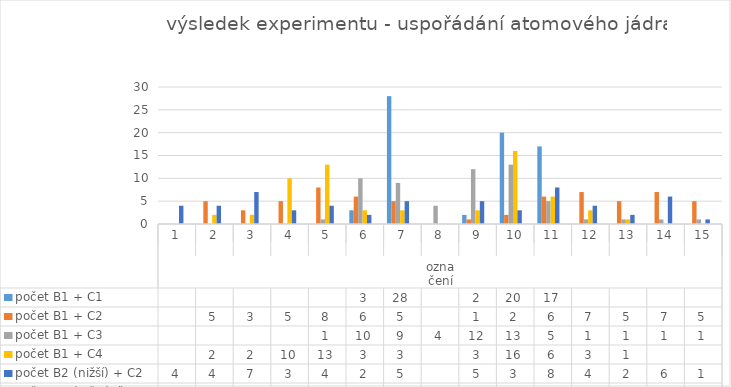
| Category | počet |
|---|---|
| 0 |  |
| 1 |  |
| 2 |  |
| 3 |  |
| 4 |  |
| 5 |  |
| 6 |  |
| 7 |  |
| 8 |  |
| 9 |  |
| 10 |  |
| 11 |  |
| 12 |  |
| 13 |  |
| 14 |  |